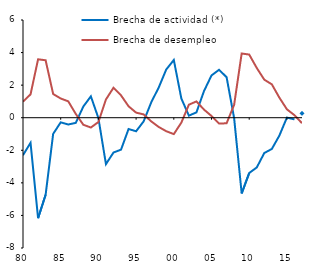
| Category | Brecha de actividad (*) | Brecha de desempleo |
|---|---|---|
| 1980-12-31 | -2.305 | 0.986 |
| 1981-12-31 | -1.541 | 1.435 |
| 1982-12-31 | -6.17 | 3.587 |
| 1983-12-31 | -4.731 | 3.527 |
| 1984-12-31 | -0.994 | 1.456 |
| 1985-12-31 | -0.284 | 1.181 |
| 1986-12-31 | -0.417 | 1.006 |
| 1987-12-31 | -0.316 | 0.232 |
| 1988-12-31 | 0.687 | -0.432 |
| 1989-12-31 | 1.312 | -0.603 |
| 1990-12-31 | -0.022 | -0.264 |
| 1991-12-31 | -2.851 | 1.121 |
| 1992-12-31 | -2.137 | 1.839 |
| 1993-12-31 | -1.961 | 1.373 |
| 1994-12-31 | -0.694 | 0.702 |
| 1995-12-31 | -0.832 | 0.312 |
| 1996-12-31 | -0.224 | 0.204 |
| 1997-12-31 | 0.939 | -0.223 |
| 1998-12-31 | 1.855 | -0.568 |
| 1999-12-31 | 2.964 | -0.83 |
| 2000-12-31 | 3.544 | -1.007 |
| 2001-12-31 | 1.178 | -0.3 |
| 2002-12-31 | 0.127 | 0.8 |
| 2003-12-31 | 0.327 | 1 |
| 2004-12-31 | 1.632 | 0.5 |
| 2005-12-31 | 2.597 | 0.105 |
| 2006-12-31 | 2.943 | -0.362 |
| 2007-12-31 | 2.488 | -0.341 |
| 2008-12-31 | -0.028 | 0.792 |
| 2009-12-31 | -4.649 | 3.944 |
| 2010-12-31 | -3.395 | 3.877 |
| 2011-12-31 | -3.055 | 3.055 |
| 2012-12-31 | -2.167 | 2.335 |
| 2013-12-31 | -1.918 | 2.049 |
| 2014-12-31 | -1.096 | 1.231 |
| 2015-12-31 | 0.009 | 0.516 |
| 2016-12-31 | -0.104 | 0.155 |
| 2017-12-31 | 0.269 | -0.338 |